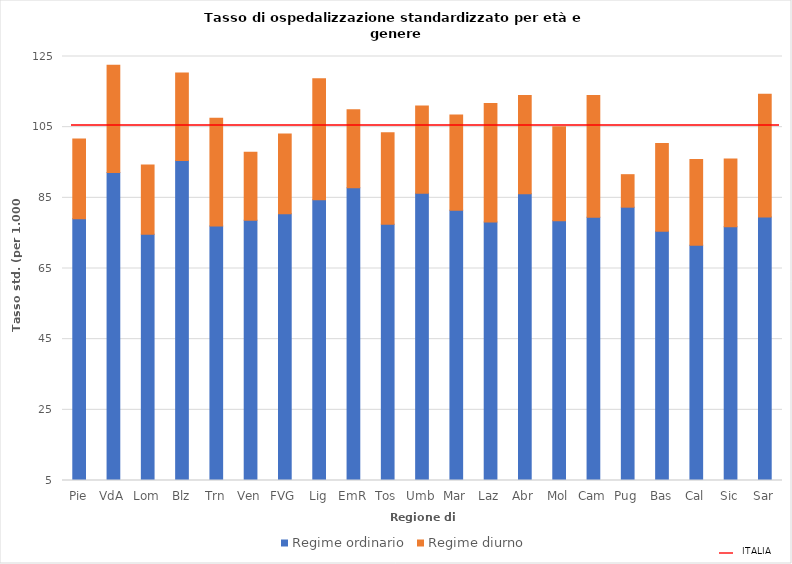
| Category | Regime ordinario | Regime diurno |
|---|---|---|
| Pie | 79.045 | 22.606 |
| VdA | 92.168 | 30.381 |
| Lom | 74.727 | 19.588 |
| Blz | 95.563 | 24.791 |
| Trn | 76.997 | 30.507 |
| Ven | 78.642 | 19.281 |
| FVG | 80.471 | 22.627 |
| Lig | 84.487 | 34.197 |
| EmR | 87.848 | 22.087 |
| Tos | 77.532 | 25.876 |
| Umb | 86.281 | 24.675 |
| Mar | 81.514 | 26.941 |
| Laz | 78.148 | 33.541 |
| Abr | 86.127 | 27.818 |
| Mol | 78.486 | 26.626 |
| Cam | 79.47 | 34.461 |
| Pug | 82.357 | 9.197 |
| Bas | 75.566 | 24.785 |
| Cal | 71.611 | 24.228 |
| Sic | 76.826 | 19.179 |
| Sar | 79.544 | 34.737 |